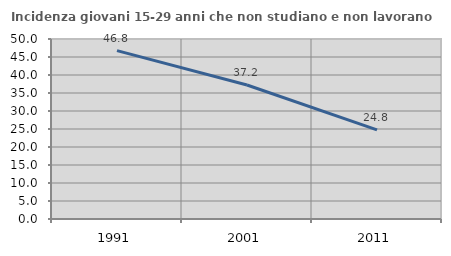
| Category | Incidenza giovani 15-29 anni che non studiano e non lavorano  |
|---|---|
| 1991.0 | 46.758 |
| 2001.0 | 37.234 |
| 2011.0 | 24.756 |